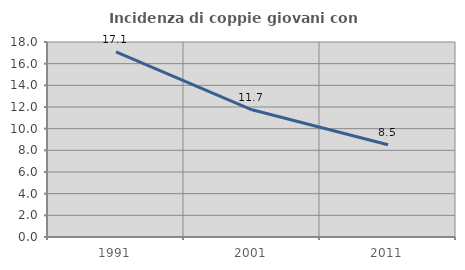
| Category | Incidenza di coppie giovani con figli |
|---|---|
| 1991.0 | 17.098 |
| 2001.0 | 11.742 |
| 2011.0 | 8.512 |